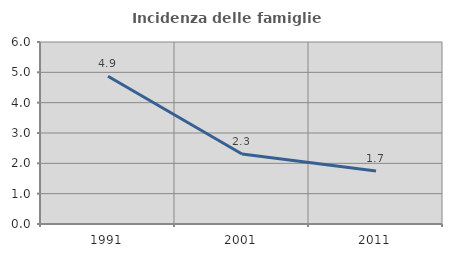
| Category | Incidenza delle famiglie numerose |
|---|---|
| 1991.0 | 4.873 |
| 2001.0 | 2.307 |
| 2011.0 | 1.744 |